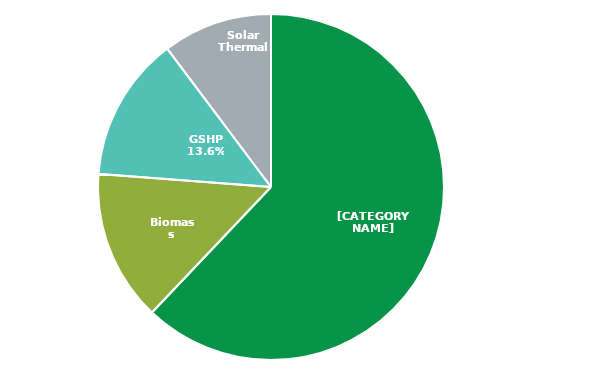
| Category | Series 0 |
|---|---|
| ASHP | 54217 |
| Biomass | 12339 |
| GSHP | 11837 |
| Solar Thermal | 8944 |